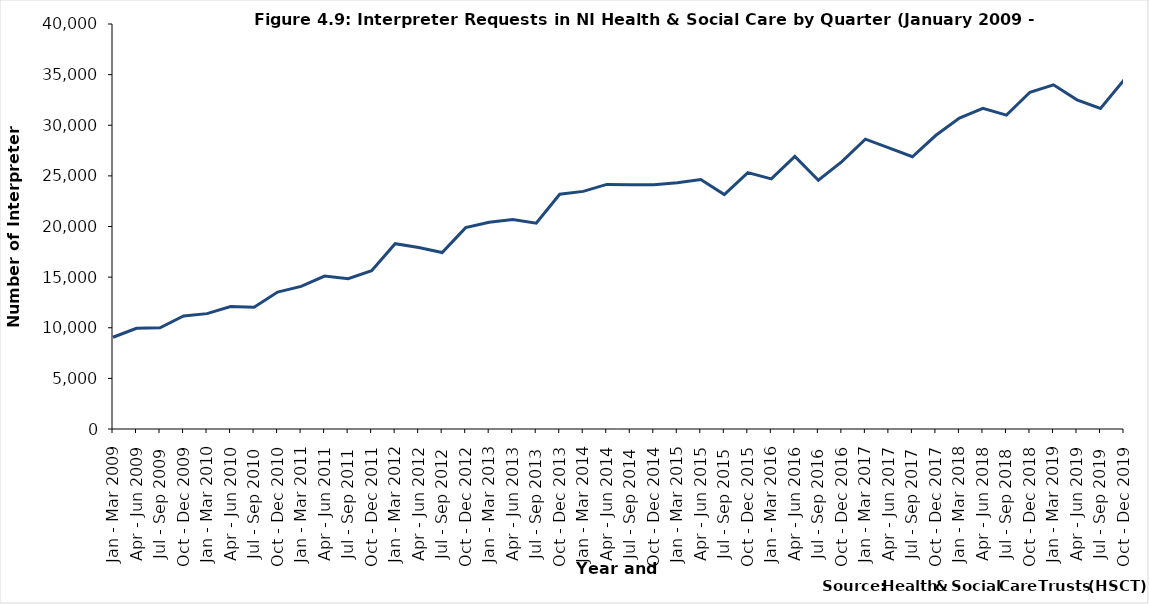
| Category | Series 0 |
|---|---|
| Jan - Mar 2009 | 9060 |
| Apr - Jun 2009 | 9950 |
| Jul - Sep 2009 | 10000 |
| Oct - Dec 2009 | 11165 |
| Jan - Mar 2010 | 11395 |
| Apr - Jun 2010 | 12095 |
| Jul - Sep 2010 | 12035 |
| Oct - Dec 2010 | 13520 |
| Jan - Mar 2011 | 14085 |
| Apr - Jun 2011 | 15100 |
| Jul - Sep 2011 | 14845 |
| Oct - Dec 2011 | 15625 |
| Jan - Mar 2012 | 18300 |
| Apr - Jun 2012 | 17920 |
| Jul - Sep 2012 | 17425 |
| Oct - Dec 2012 | 19890 |
| Jan - Mar 2013 | 20410 |
| Apr - Jun 2013 | 20695 |
| Jul - Sep 2013 | 20335 |
| Oct - Dec 2013 | 23185 |
| Jan - Mar 2014 | 23470 |
| Apr - Jun 2014 | 24160 |
| Jul - Sep 2014 | 24135 |
| Oct - Dec 2014 | 24130 |
| Jan - Mar 2015 | 24325 |
| Apr - Jun 2015 | 24640 |
| Jul - Sep 2015 | 23160 |
| Oct - Dec 2015 | 25320 |
| Jan - Mar 2016 | 24705 |
| Apr - Jun 2016 | 26930 |
| Jul - Sep 2016 | 24570 |
| Oct - Dec 2016 | 26410 |
| Jan - Mar 2017 | 28625 |
| Apr - Jun 2017 | 27770 |
| Jul - Sep 2017 | 26890 |
| Oct - Dec 2017 | 29010 |
| Jan - Mar 2018 | 30710 |
| Apr - Jun 2018 | 31670 |
| Jul - Sep 2018 | 31000 |
| Oct - Dec 2018 | 33260 |
| Jan - Mar 2019 | 33990 |
| Apr - Jun 2019 | 32510 |
| Jul - Sep 2019 | 31660 |
| Oct - Dec 2019 | 34485 |